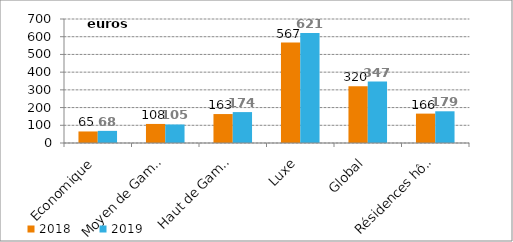
| Category | 2018 | 2019 |
|---|---|---|
| Economique | 65.162 | 68.48 |
| Moyen de Gamme | 107.611 | 104.63 |
| Haut de Gamme | 163.412 | 174.473 |
| Luxe | 567.276 | 620.693 |
| Global | 319.885 | 346.768 |
| Résidences hôtelières | 165.887 | 178.993 |